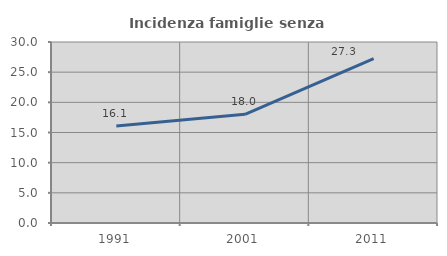
| Category | Incidenza famiglie senza nuclei |
|---|---|
| 1991.0 | 16.06 |
| 2001.0 | 18.018 |
| 2011.0 | 27.256 |